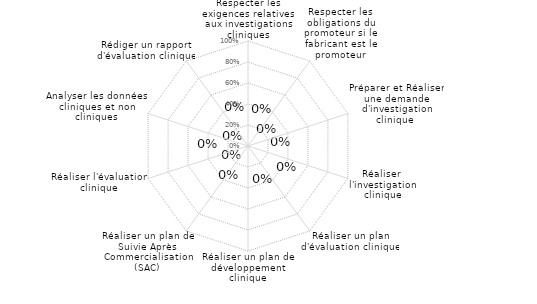
| Category | Series 0 |
|---|---|
| 0 | 0 |
| 1 | 0 |
| 2 | 0 |
| 3 | 0 |
| 4 | 0 |
| 5 | 0 |
| 6 | 0 |
| 7 | 0 |
| 8 | 0 |
| 9 | 0 |